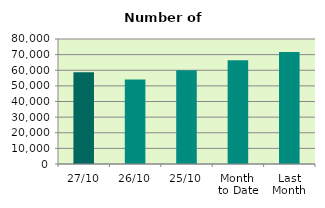
| Category | Series 0 |
|---|---|
| 27/10 | 58790 |
| 26/10 | 54034 |
| 25/10 | 59976 |
| Month 
to Date | 66457.895 |
| Last
Month | 71692 |